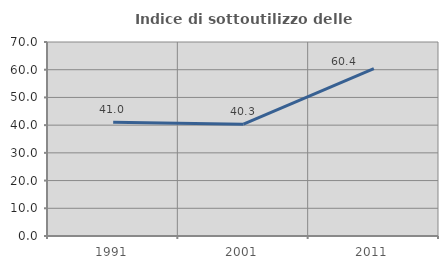
| Category | Indice di sottoutilizzo delle abitazioni  |
|---|---|
| 1991.0 | 41.039 |
| 2001.0 | 40.336 |
| 2011.0 | 60.356 |